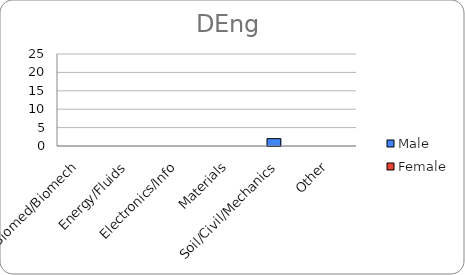
| Category | Male | Female |
|---|---|---|
| Biomed/Biomech | 0 | 0 |
| Energy/Fluids | 0 | 0 |
| Electronics/Info | 0 | 0 |
| Materials | 0 | 0 |
| Soil/Civil/Mechanics | 2 | 0 |
| Other | 0 | 0 |